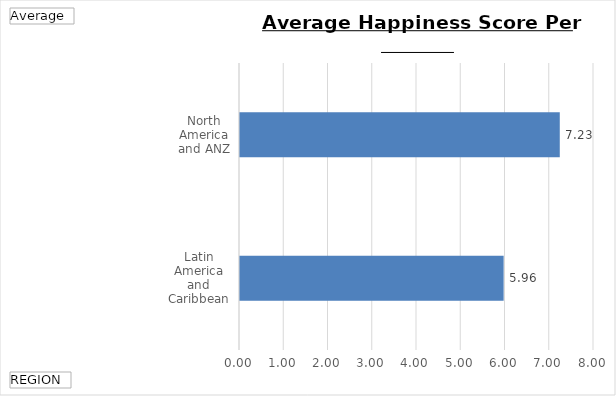
| Category | Total |
|---|---|
| Latin America and Caribbean | 5.958 |
| North America and ANZ | 7.227 |